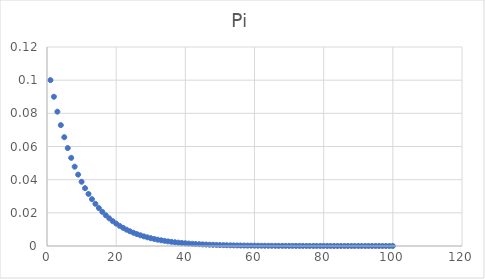
| Category | Pi |
|---|---|
| 1.0 | 0.1 |
| 2.0 | 0.09 |
| 3.0 | 0.081 |
| 4.0 | 0.073 |
| 5.0 | 0.066 |
| 6.0 | 0.059 |
| 7.0 | 0.053 |
| 8.0 | 0.048 |
| 9.0 | 0.043 |
| 10.0 | 0.039 |
| 11.0 | 0.035 |
| 12.0 | 0.031 |
| 13.0 | 0.028 |
| 14.0 | 0.025 |
| 15.0 | 0.023 |
| 16.0 | 0.021 |
| 17.0 | 0.019 |
| 18.0 | 0.017 |
| 19.0 | 0.015 |
| 20.0 | 0.014 |
| 21.0 | 0.012 |
| 22.0 | 0.011 |
| 23.0 | 0.01 |
| 24.0 | 0.009 |
| 25.0 | 0.008 |
| 26.0 | 0.007 |
| 27.0 | 0.006 |
| 28.0 | 0.006 |
| 29.0 | 0.005 |
| 30.0 | 0.005 |
| 31.0 | 0.004 |
| 32.0 | 0.004 |
| 33.0 | 0.003 |
| 34.0 | 0.003 |
| 35.0 | 0.003 |
| 36.0 | 0.003 |
| 37.0 | 0.002 |
| 38.0 | 0.002 |
| 39.0 | 0.002 |
| 40.0 | 0.002 |
| 41.0 | 0.001 |
| 42.0 | 0.001 |
| 43.0 | 0.001 |
| 44.0 | 0.001 |
| 45.0 | 0.001 |
| 46.0 | 0.001 |
| 47.0 | 0.001 |
| 48.0 | 0.001 |
| 49.0 | 0.001 |
| 50.0 | 0.001 |
| 51.0 | 0.001 |
| 52.0 | 0 |
| 53.0 | 0 |
| 54.0 | 0 |
| 55.0 | 0 |
| 56.0 | 0 |
| 57.0 | 0 |
| 58.0 | 0 |
| 59.0 | 0 |
| 60.0 | 0 |
| 61.0 | 0 |
| 62.0 | 0 |
| 63.0 | 0 |
| 64.0 | 0 |
| 65.0 | 0 |
| 66.0 | 0 |
| 67.0 | 0 |
| 68.0 | 0 |
| 69.0 | 0 |
| 70.0 | 0 |
| 71.0 | 0 |
| 72.0 | 0 |
| 73.0 | 0 |
| 74.0 | 0 |
| 75.0 | 0 |
| 76.0 | 0 |
| 77.0 | 0 |
| 78.0 | 0 |
| 79.0 | 0 |
| 80.0 | 0 |
| 81.0 | 0 |
| 82.0 | 0 |
| 83.0 | 0 |
| 84.0 | 0 |
| 85.0 | 0 |
| 86.0 | 0 |
| 87.0 | 0 |
| 88.0 | 0 |
| 89.0 | 0 |
| 90.0 | 0 |
| 91.0 | 0 |
| 92.0 | 0 |
| 93.0 | 0 |
| 94.0 | 0 |
| 95.0 | 0 |
| 96.0 | 0 |
| 97.0 | 0 |
| 98.0 | 0 |
| 99.0 | 0 |
| 100.0 | 0 |